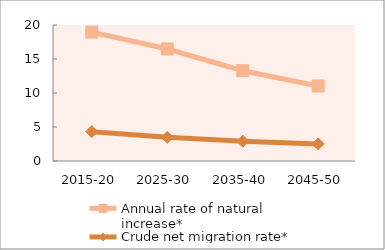
| Category | Annual rate of natural increase* | Crude net migration rate* |
|---|---|---|
| 2015-20 | 18.955 | 4.318 |
| 2025-30 | 16.473 | 3.477 |
| 2035-40 | 13.279 | 2.905 |
| 2045-50 | 11.03 | 2.506 |